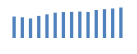
| Category | Exportações (1) |
|---|---|
| 0 | 595986.616 |
| 1 | 575965.577 |
| 2 | 544011.291 |
| 3 | 614380.205 |
| 4 | 656918.26 |
| 5 | 703504.835 |
| 6 | 720793.562 |
| 7 | 726284.803 |
| 8 | 735533.905 |
| 9 | 723973.625 |
| 10 | 778041 |
| 11 | 800341.537 |
| 12 | 819402.338 |
| 13 | 847113.297 |